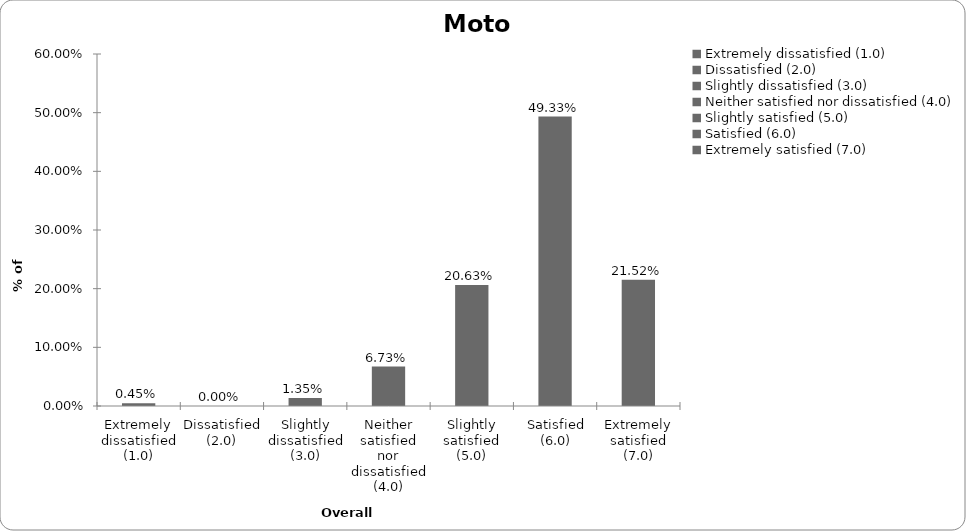
| Category | Motor |
|---|---|
| Extremely dissatisfied (1.0) | 0.004 |
| Dissatisfied (2.0) | 0 |
| Slightly dissatisfied (3.0) | 0.013 |
| Neither satisfied nor dissatisfied (4.0) | 0.067 |
| Slightly satisfied (5.0) | 0.206 |
| Satisfied (6.0) | 0.493 |
| Extremely satisfied (7.0) | 0.215 |